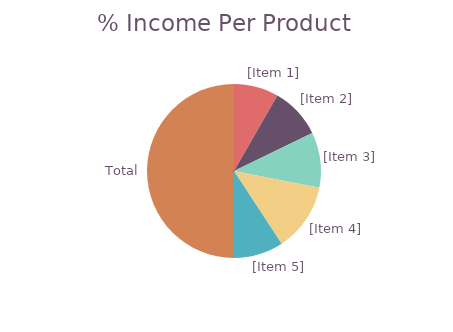
| Category | Total 
Income |
|---|---|
| [Item 1] | 196.75 |
| [Item 2] | 224.625 |
| [Item 3] | 244 |
| [Item 4] | 300 |
| [Item 5] | 218.4 |